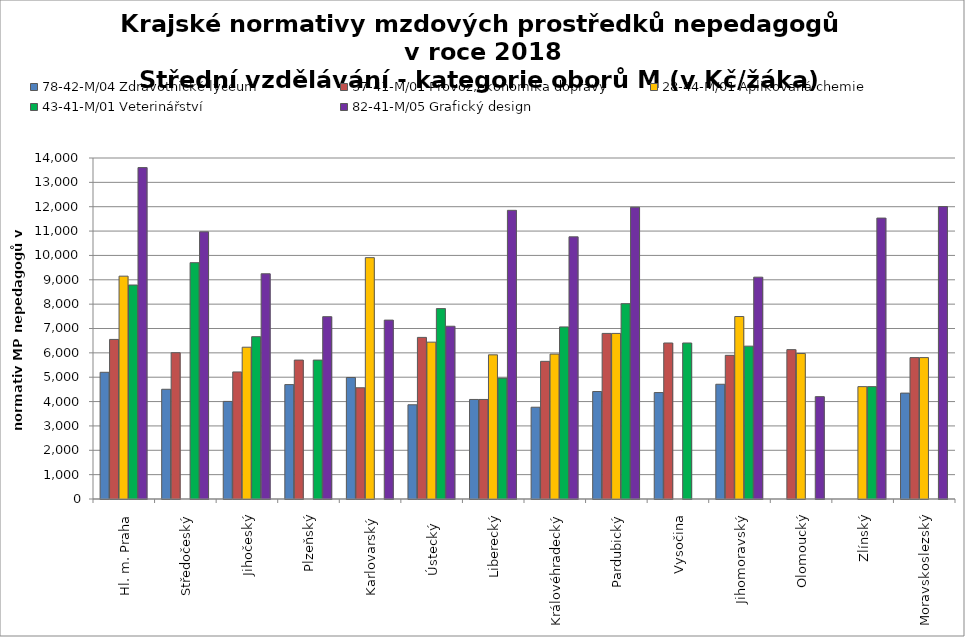
| Category | 78-42-M/04 Zdravotnické lyceum | 37-41-M/01 Provoz,ekonomika dopravy | 28-44-M/01 Aplikovaná chemie | 43-41-M/01 Veterinářství | 82-41-M/05 Grafický design |
|---|---|---|---|---|---|
| Hl. m. Praha | 5202.353 | 6551.111 | 9148.966 | 8785.43 | 13606.154 |
| Středočeský | 4504.714 | 6006.286 | 0 | 9702.462 | 10968 |
| Jihočeský | 4006.206 | 5216.535 | 6231.996 | 6664.02 | 9246.542 |
| Plzeňský | 4696.941 | 5703.429 | 0 | 5703.429 | 7485.75 |
| Karlovarský  | 4988.453 | 4566.596 | 9908.257 | 0 | 7344.441 |
| Ústecký   | 3868.582 | 6634.612 | 6439.831 | 7816.752 | 7092.4 |
| Liberecký | 4086.831 | 4086.831 | 5918.71 | 4962.902 | 11851.11 |
| Královéhradecký | 3767.96 | 5651.94 | 5949.411 | 7064.925 | 10763.051 |
| Pardubický | 4412.842 | 6798.162 | 6798.162 | 8018.234 | 11977.714 |
| Vysočina | 4369.56 | 6404.933 | 0 | 6404.933 | 0 |
| Jihomoravský | 4710.556 | 5897.679 | 7490.975 | 6275.202 | 9107.535 |
| Olomoucký | 0 | 6132.616 | 5972.035 | 0 | 4202.543 |
| Zlínský | 0 | 0 | 4613.52 | 4613.52 | 11533.8 |
| Moravskoslezský | 4348.023 | 5805.381 | 5805.381 | 0 | 12006.24 |